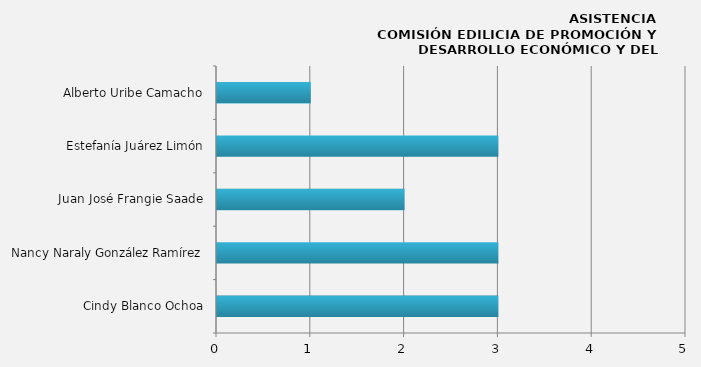
| Category | Series 0 |
|---|---|
| Cindy Blanco Ochoa | 3 |
| Nancy Naraly González Ramírez | 3 |
| Juan José Frangie Saade | 2 |
| Estefanía Juárez Limón | 3 |
| Alberto Uribe Camacho | 1 |